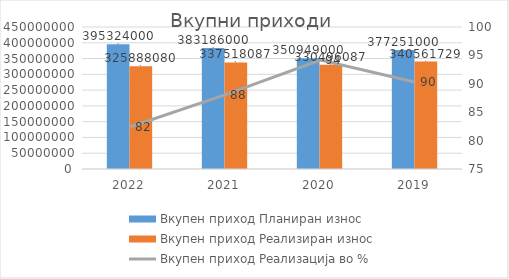
| Category | Вкупен приход Планиран износ | Вкупен приход Реализиран износ |
|---|---|---|
| 2022.0 | 395324000 | 325888080 |
| 2021.0 | 383186000 | 337518087 |
| 2020.0 | 350949000 | 330496087 |
| 2019.0 | 377251000 | 340561729 |